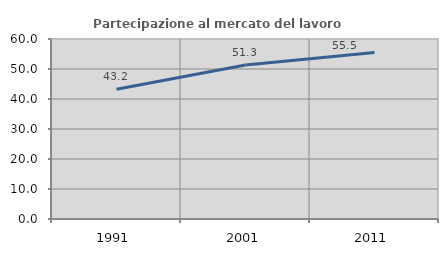
| Category | Partecipazione al mercato del lavoro  femminile |
|---|---|
| 1991.0 | 43.24 |
| 2001.0 | 51.347 |
| 2011.0 | 55.493 |